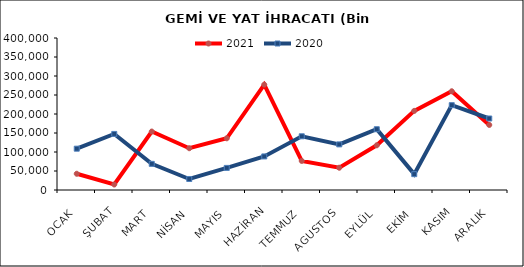
| Category | 2021 | 2020 |
|---|---|---|
| OCAK | 42744.005 | 108751.995 |
| ŞUBAT | 14435.763 | 147559.765 |
| MART | 153858.56 | 68797.787 |
| NİSAN | 109911.397 | 28953.639 |
| MAYIS | 136047.26 | 58162.571 |
| HAZİRAN | 277348.91 | 88349.361 |
| TEMMUZ | 76572.63 | 141332.838 |
| AGUSTOS | 58623.439 | 120028.256 |
| EYLÜL | 117629.915 | 159923.622 |
| EKİM | 208205.03 | 41729.864 |
| KASIM | 259778.329 | 223265.957 |
| ARALIK | 171221.635 | 188150.699 |